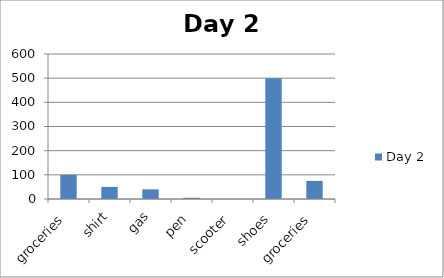
| Category | Day 2 |
|---|---|
| groceries | 100 |
| shirt | 50 |
| gas | 40 |
| pen | 5 |
| scooter | 0 |
| shoes | 500 |
| groceries | 75 |